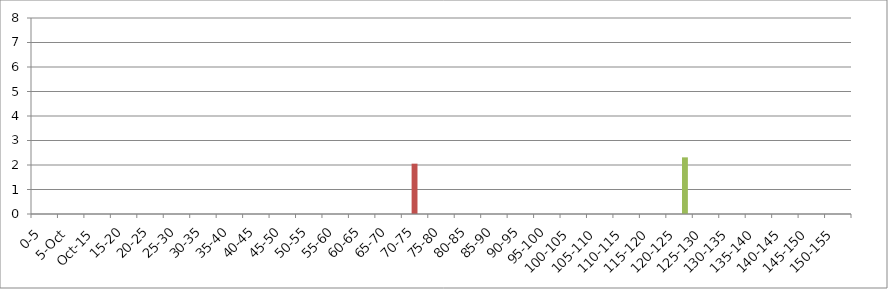
| Category | 119875 | 146067 | 241240 |
|---|---|---|---|
| 0-5 | 0 | 0 | 0 |
| 5-Oct | 0 | 0 | 0 |
| Oct-15 | 0 | 0 | 0 |
| 15-20 | 0 | 0 | 0 |
| 20-25 | 0 | 0 | 0 |
| 25-30 | 0 | 0 | 0 |
| 30-35 | 0 | 0 | 0 |
| 35-40 | 0 | 0 | 0 |
| 40-45 | 0 | 0 | 0 |
| 45-50 | 0 | 0 | 0 |
| 50-55 | 0 | 0 | 0 |
| 55-60 | 0 | 0 | 0 |
| 60-65 | 0 | 0 | 0 |
| 65-70 | 0 | 0 | 0 |
| 70-75 | 0 | 2.054 | 0 |
| 75-80 | 0 | 0 | 0 |
| 80-85 | 0 | 0 | 0 |
| 85-90 | 0 | 0 | 0 |
| 90-95 | 0 | 0 | 0 |
| 95-100 | 0 | 0 | 0 |
| 100-105 | 0 | 0 | 0 |
| 105-110 | 0 | 0 | 0 |
| 110-115 | 0 | 0 | 0 |
| 115-120 | 0 | 0 | 0 |
| 120-125 | 0 | 0 | 2.312 |
| 125-130 | 0 | 0 | 0 |
| 130-135 | 0 | 0 | 0 |
| 135-140 | 0 | 0 | 0 |
| 140-145 | 0 | 0 | 0 |
| 145-150 | 0 | 0 | 0 |
| 150-155 | 0 | 0 | 0 |